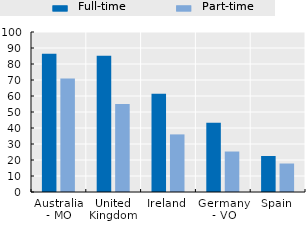
| Category | Full-time | Part-time |
|---|---|---|
| Australia - MO | 86.4 | 71 |
| United Kingdom | 85.1 | 55 |
| Ireland | 61.4 | 36 |
| Germany - VO | 43.3 | 25.3 |
| Spain | 22.5 | 17.8 |